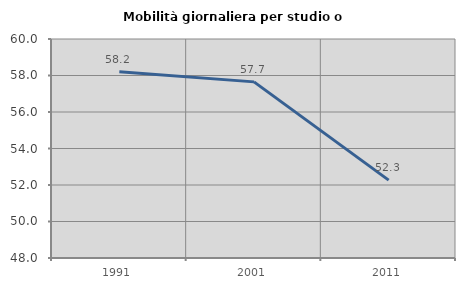
| Category | Mobilità giornaliera per studio o lavoro |
|---|---|
| 1991.0 | 58.204 |
| 2001.0 | 57.651 |
| 2011.0 | 52.265 |